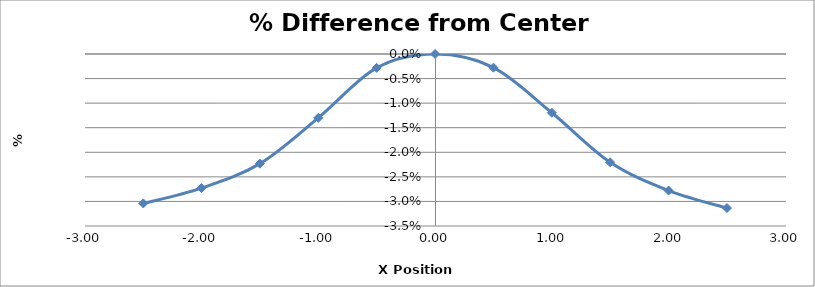
| Category | Series 0 |
|---|---|
| -2.5010000000000003 | -0.03 |
| -2.003 | -0.027 |
| -1.5030000000000001 | -0.022 |
| -1.0030000000000001 | -0.013 |
| -0.5040000000000004 | -0.003 |
| -0.004000000000000448 | 0 |
| 0.49599999999999955 | -0.003 |
| 0.9959999999999996 | -0.012 |
| 1.495 | -0.022 |
| 1.995 | -0.028 |
| 2.495 | -0.031 |